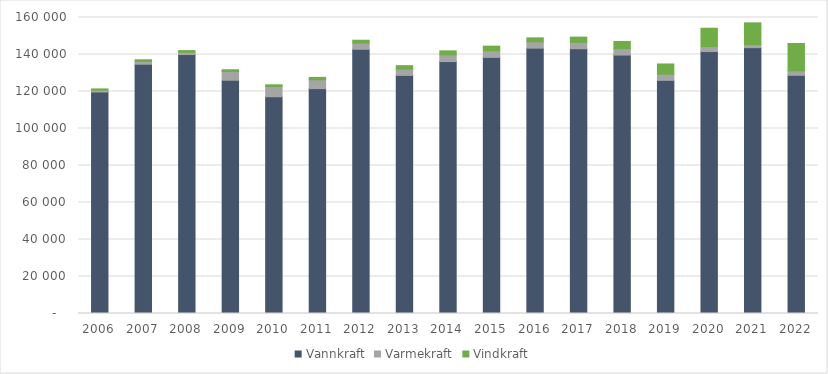
| Category | Vannkraft | Varmekraft | Vindkraft | Series 3 |
|---|---|---|---|---|
| 2006 | 119729 | 1035 | 636 |  |
| 2007 | 134736 | 1536 | 892 |  |
| 2008 | 139981 | 1214 | 913 |  |
| 2009 | 126077 | 4719 | 977 |  |
| 2010 | 117152 | 5599 | 879 |  |
| 2011 | 121553 | 4795 | 1283 |  |
| 2012 | 142810 | 3358 | 1548 |  |
| 2013 | 128699 | 3395 | 1881 |  |
| 2014 | 136181 | 3570 | 2217 |  |
| 2015 | 138450 | 3546 | 2515 |  |
| 2016 | 143417 | 3456 | 2116 |  |
| 2017 | 143112 | 3436 | 2854 |  |
| 2018 | 139704 | 3476 | 3877 |  |
| 2019 | 126030 | 3328 | 5525 |  |
| 2020 | 141590 | 2696 | 9911 |  |
| 2021 | 143699 | 1646 | 11768 |  |
| 2022 | 128749 | 2383 | 14810 |  |